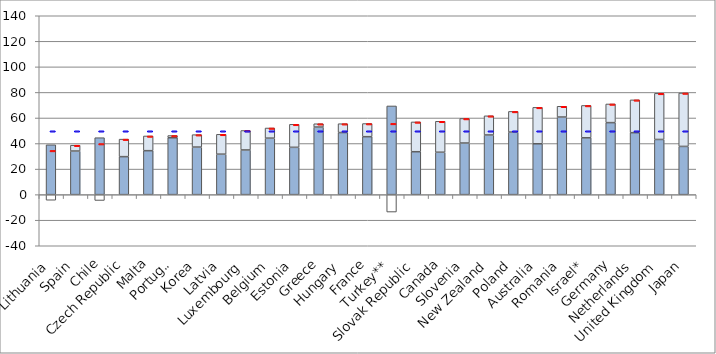
| Category | Gross Earnings | Net taxes | Net transfers |
|---|---|---|---|
| Lithuania | 39.006 | -4.386 | 0 |
| Spain | 34.12 | 0 | 4.569 |
| Chile | 44.569 | -4.574 | 0 |
| Czech Republic | 29.739 | 0 | 13.708 |
| Malta | 34.421 | 0 | 11.497 |
| Portugal | 44.527 | 0 | 1.73 |
| Korea | 37.229 | 0 | 9.714 |
| Latvia | 31.676 | 0 | 15.539 |
| Luxembourg | 34.967 | 0 | 15.238 |
| Belgium | 44.209 | 0 | 7.954 |
| Estonia | 37.031 | 0 | 18.019 |
| Greece | 52.895 | 0 | 2.584 |
| Hungary | 48.586 | 0 | 6.94 |
| France | 45.36 | 0 | 10.285 |
| Turkey** | 69.411 | -13.629 | 0 |
| Slovak Republic | 33.595 | 0 | 23.324 |
| Canada | 33.197 | 0 | 24.217 |
| Slovenia | 40.389 | 0 | 19.225 |
| New Zealand | 46.687 | 0 | 15.003 |
| Poland | 48.953 | 0 | 16.187 |
| Australia | 39.811 | 0 | 28.5 |
| Romania | 60.739 | 0 | 8.428 |
| Israel* | 44.494 | 0 | 25.315 |
| Germany | 56.361 | 0 | 14.608 |
| Netherlands | 48.493 | 0 | 25.691 |
| United Kingdom | 43.18 | 0 | 36.105 |
| Japan | 37.735 | 0 | 41.813 |